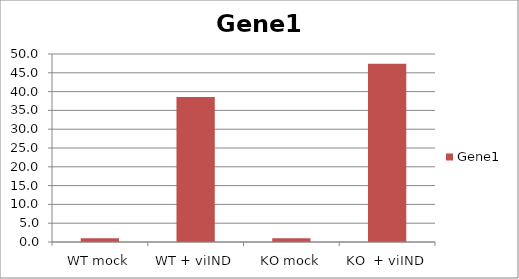
| Category | Gene1 |
|---|---|
| WT mock | 1 |
| WT + viIND | 38.556 |
| KO mock | 1 |
| KO  + viIND | 47.432 |